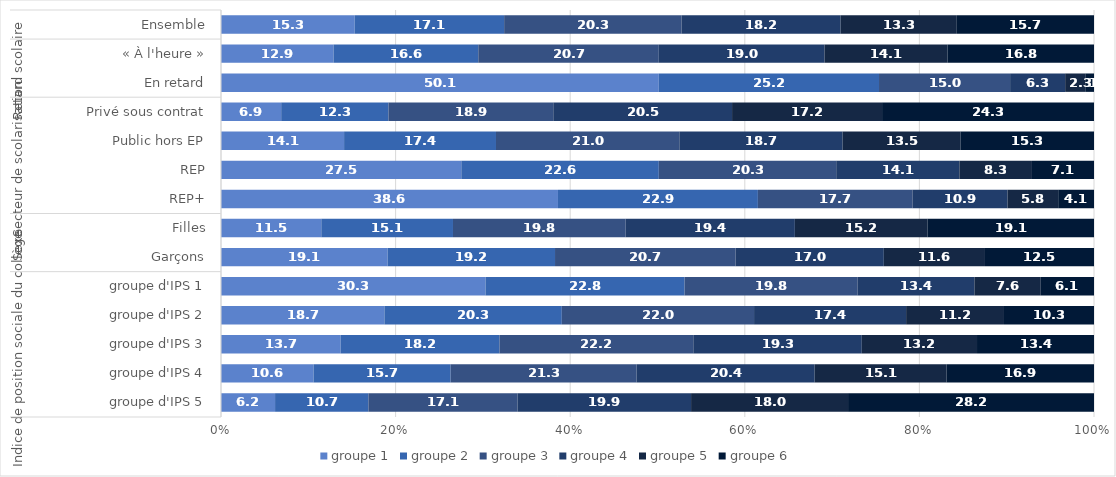
| Category | groupe 1 | groupe 2 | groupe 3 | groupe 4 | groupe 5 | groupe 6 |
|---|---|---|---|---|---|---|
| 0 | 15.3 | 17.1 | 20.3 | 18.2 | 13.3 | 15.7 |
| 1 | 12.9 | 16.6 | 20.7 | 19 | 14.1 | 16.8 |
| 2 | 50.1 | 25.2 | 15 | 6.3 | 2.3 | 1 |
| 3 | 6.9 | 12.3 | 18.9 | 20.5 | 17.2 | 24.3 |
| 4 | 14.1 | 17.4 | 21 | 18.7 | 13.5 | 15.3 |
| 5 | 27.5 | 22.6 | 20.3 | 14.1 | 8.3 | 7.1 |
| 6 | 38.6 | 22.9 | 17.7 | 10.9 | 5.8 | 4.1 |
| 7 | 11.5 | 15.1 | 19.8 | 19.4 | 15.2 | 19.1 |
| 8 | 19.1 | 19.2 | 20.7 | 17 | 11.6 | 12.5 |
| 9 | 30.3 | 22.8 | 19.8 | 13.4 | 7.6 | 6.1 |
| 10 | 18.7 | 20.3 | 22 | 17.4 | 11.2 | 10.3 |
| 11 | 13.7 | 18.2 | 22.2 | 19.3 | 13.2 | 13.4 |
| 12 | 10.6 | 15.7 | 21.3 | 20.4 | 15.1 | 16.9 |
| 13 | 6.2 | 10.7 | 17.1 | 19.9 | 18 | 28.2 |